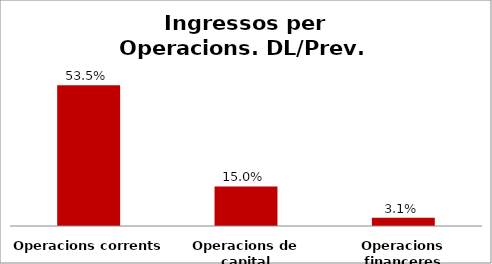
| Category | Series 0 |
|---|---|
| Operacions corrents | 0.535 |
| Operacions de capital | 0.15 |
| Operacions financeres | 0.031 |